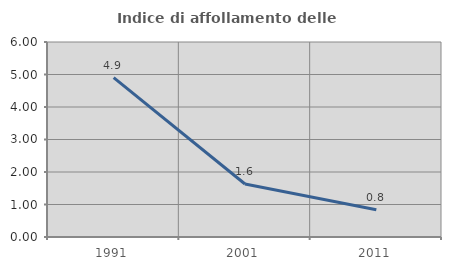
| Category | Indice di affollamento delle abitazioni  |
|---|---|
| 1991.0 | 4.903 |
| 2001.0 | 1.63 |
| 2011.0 | 0.84 |